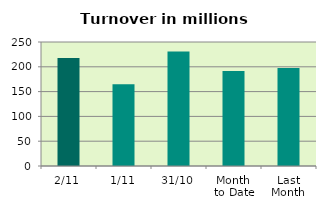
| Category | Series 0 |
|---|---|
| 2/11 | 217.898 |
| 1/11 | 164.909 |
| 31/10 | 231.062 |
| Month 
to Date | 191.404 |
| Last
Month | 197.652 |